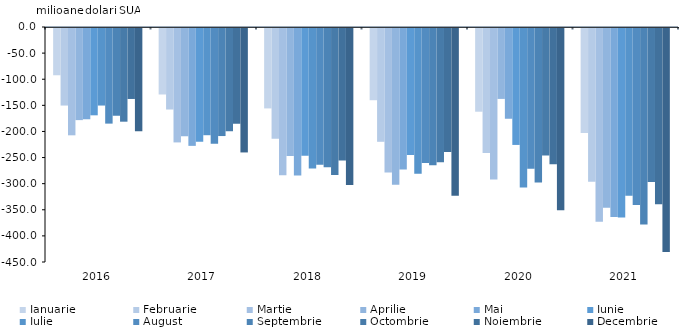
| Category | Ianuarie | Februarie | Martie | Aprilie | Mai | Iunie | Iulie | August | Septembrie | Octombrie | Noiembrie | Decembrie |
|---|---|---|---|---|---|---|---|---|---|---|---|---|
| 2016.0 | -90.5 | -148.5 | -205.5 | -176.4 | -174.7 | -167.2 | -148.5 | -183.1 | -168 | -179.4 | -135.9 | -197.9 |
| 2017.0 | -127.3 | -156.1 | -219.1 | -207.3 | -225.7 | -217.7 | -205.3 | -221.8 | -206.9 | -197.7 | -183.2 | -238.3 |
| 2018.0 | -154 | -212.1 | -282 | -244.9 | -282.6 | -244.6 | -269.2 | -262.1 | -266.7 | -281.6 | -253.7 | -300.5 |
| 2019.0 | -138.3 | -217.9 | -276.6 | -300 | -271.1 | -243.2 | -278.9 | -258.5 | -262.9 | -257 | -237.5 | -321.4 |
| 2020.0 | -160.3 | -239.5 | -290.3 | -135.8 | -173.7 | -223.9 | -305.5 | -269.7 | -296 | -244.2 | -260.9 | -349 |
| 2021.0 | -201 | -294.4 | -370.8 | -344 | -361.7 | -362.9 | -321.3 | -338.7 | -376.3 | -294.7 | -337.6 | -429 |